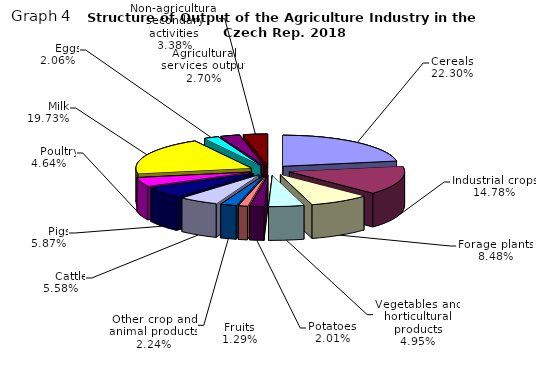
| Category | Series 0 |
|---|---|
| Cereals | 30263.53 |
| Industrial crops | 20058.765 |
| Forage plants | 11503.92 |
| Vegetables and horticultural products | 6720.205 |
| Potatoes | 2729.272 |
| Fruits | 1744.643 |
| Other crop and animal products | 3045.05 |
|      Cattle | 7570.144 |
|      Pigs | 7961.411 |
|      Poultry | 6290.223 |
|      Milk | 26763.269 |
|      Eggs | 2789.715 |
| Agricultural services output | 3657.389 |
| Non-agricultural secondary activities | 4584.155 |